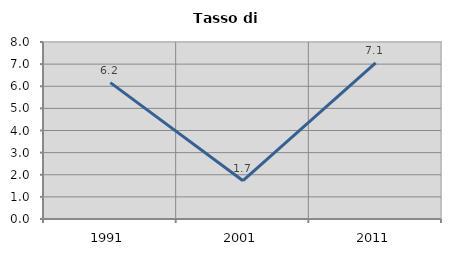
| Category | Tasso di disoccupazione   |
|---|---|
| 1991.0 | 6.163 |
| 2001.0 | 1.729 |
| 2011.0 | 7.054 |